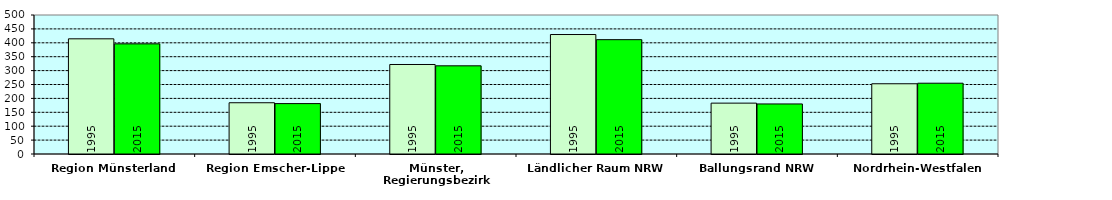
| Category | 1995 | 2015 |
|---|---|---|
| Region Münsterland | 414.293 | 396.192 |
| Region Emscher-Lippe | 184.358 | 181.277 |
| Münster, Regierungsbezirk | 321.989 | 317.179 |
| Ländlicher Raum NRW | 429.75 | 411.299 |
| Ballungsrand NRW | 182.968 | 180.073 |
| Nordrhein-Westfalen | 252.678 | 254.651 |